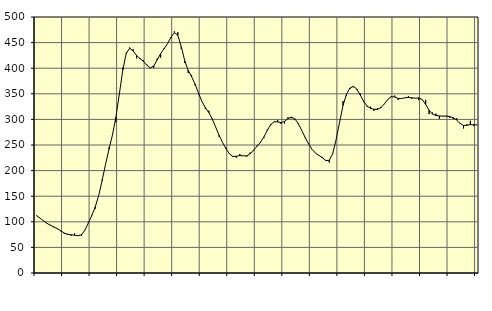
| Category | Piggar | Series 1 |
|---|---|---|
| nan | 112.6 | 111.55 |
| 87.0 | 106.8 | 107.05 |
| 87.0 | 101.5 | 101.86 |
| 87.0 | 96.1 | 96.95 |
| nan | 94.1 | 93.03 |
| 88.0 | 89.1 | 89.92 |
| 88.0 | 87.4 | 86.42 |
| 88.0 | 81.3 | 82.45 |
| nan | 76.8 | 78.13 |
| 89.0 | 76.6 | 75.27 |
| 89.0 | 72.8 | 74.58 |
| 89.0 | 77.5 | 73.81 |
| nan | 72.3 | 72.68 |
| 90.0 | 72.5 | 74.76 |
| 90.0 | 84.2 | 83.66 |
| 90.0 | 99.8 | 97.56 |
| nan | 113.4 | 112.34 |
| 91.0 | 125.5 | 128.88 |
| 91.0 | 150.9 | 151.23 |
| 91.0 | 182.5 | 180.39 |
| nan | 212.5 | 212.48 |
| 92.0 | 245.4 | 241.79 |
| 92.0 | 269.9 | 269.59 |
| 92.0 | 294.5 | 304.08 |
| nan | 348.5 | 349.37 |
| 93.0 | 400.9 | 396.15 |
| 93.0 | 430.1 | 428.76 |
| 93.0 | 440.4 | 439.11 |
| nan | 436.9 | 433.86 |
| 94.0 | 419.2 | 424.92 |
| 94.0 | 420 | 418.75 |
| 94.0 | 415.8 | 413.46 |
| nan | 406.9 | 405.74 |
| 95.0 | 399.9 | 400.56 |
| 95.0 | 400.6 | 404.35 |
| 95.0 | 418.9 | 416.03 |
| nan | 420.8 | 428.51 |
| 96.0 | 439.4 | 438.06 |
| 96.0 | 448 | 447.82 |
| 96.0 | 459.1 | 460.37 |
| nan | 472 | 469.51 |
| 97.0 | 470.4 | 464.2 |
| 97.0 | 437.6 | 441.94 |
| 97.0 | 410.1 | 414.73 |
| nan | 390.8 | 395.71 |
| 98.0 | 386.9 | 383.34 |
| 98.0 | 366.6 | 369.16 |
| 98.0 | 348.7 | 351.7 |
| nan | 335.1 | 334.78 |
| 99.0 | 320.2 | 323.13 |
| 99.0 | 317.1 | 313.22 |
| 99.0 | 301.7 | 300.85 |
| nan | 284.7 | 284.88 |
| 0.0 | 265.7 | 268.7 |
| 0.0 | 254.6 | 254.85 |
| 0.0 | 244.8 | 242.7 |
| nan | 232.9 | 232.53 |
| 1.0 | 226.8 | 227.51 |
| 1.0 | 225.2 | 227.99 |
| 1.0 | 232.4 | 229.37 |
| nan | 228.6 | 228.85 |
| 2.0 | 226.8 | 228.76 |
| 2.0 | 235.4 | 232.74 |
| 2.0 | 238.6 | 239.9 |
| nan | 248.9 | 247.36 |
| 3.0 | 254.2 | 255.31 |
| 3.0 | 263.4 | 265.8 |
| 3.0 | 281 | 278.67 |
| nan | 290.9 | 289.82 |
| 4.0 | 296.1 | 295.38 |
| 4.0 | 298.3 | 295.11 |
| 4.0 | 291.1 | 293.65 |
| nan | 292 | 296.16 |
| 5.0 | 304.2 | 301.51 |
| 5.0 | 302.2 | 304.41 |
| 5.0 | 299.8 | 301.09 |
| nan | 293 | 291.59 |
| 6.0 | 278.6 | 278.48 |
| 6.0 | 263.6 | 264.63 |
| 6.0 | 253.8 | 252.04 |
| nan | 241.1 | 241.46 |
| 7.0 | 234.2 | 234.05 |
| 7.0 | 229.3 | 229.76 |
| 7.0 | 226.8 | 225.03 |
| nan | 220.8 | 219.6 |
| 8.0 | 215.7 | 220.02 |
| 8.0 | 232.7 | 233.36 |
| 8.0 | 261 | 260.82 |
| nan | 295.4 | 294.67 |
| 9.0 | 335.9 | 327.29 |
| 9.0 | 346.1 | 349.31 |
| 9.0 | 359.4 | 361.2 |
| nan | 362.8 | 364.5 |
| 10.0 | 358.1 | 359.37 |
| 10.0 | 350.4 | 347.63 |
| 10.0 | 333.6 | 334.97 |
| nan | 324.4 | 326.01 |
| 11.0 | 324.9 | 321.44 |
| 11.0 | 316.6 | 319.78 |
| 11.0 | 322.3 | 319.66 |
| nan | 324 | 322.89 |
| 12.0 | 329.8 | 330.37 |
| 12.0 | 339.7 | 339.02 |
| 12.0 | 345.3 | 344.35 |
| nan | 346.5 | 343.79 |
| 13.0 | 338.1 | 341.04 |
| 13.0 | 340.7 | 340.71 |
| 13.0 | 341.8 | 342.22 |
| nan | 345.5 | 342.98 |
| 14.0 | 340.1 | 342.11 |
| 14.0 | 341.6 | 341.49 |
| 14.0 | 337.6 | 342.04 |
| nan | 339.4 | 338.8 |
| 15.0 | 338.2 | 329.39 |
| 15.0 | 310.3 | 317.9 |
| 15.0 | 313.5 | 310.26 |
| nan | 311.3 | 307.63 |
| 16.0 | 301.2 | 306.75 |
| 16.0 | 306 | 306.46 |
| 16.0 | 307.3 | 306.37 |
| nan | 303.2 | 305.44 |
| 17.0 | 300.7 | 303.27 |
| 17.0 | 302.1 | 298.77 |
| 17.0 | 293 | 292.28 |
| nan | 282.4 | 288.1 |
| 18.0 | 290.5 | 288.53 |
| 18.0 | 297.4 | 289.86 |
| 18.0 | 287.3 | 289.45 |
| nan | 289.5 | 289.27 |